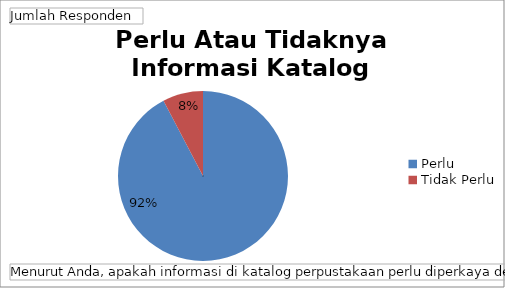
| Category | Total |
|---|---|
| Perlu | 72 |
| Tidak Perlu | 6 |